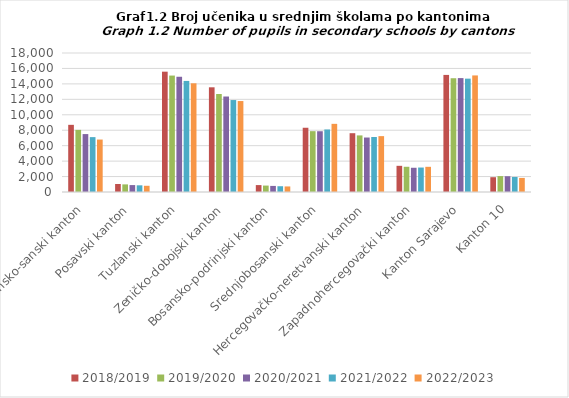
| Category | 2018/2019 | 2019/2020 | 2020/2021 | 2021/2022 | 2022/2023 |
|---|---|---|---|---|---|
| Unsko-sanski kanton | 8698 | 8046 | 7501 | 7107 | 6792 |
| Posavski kanton | 1037 | 986 | 896 | 865 | 805 |
| Tuzlanski kanton | 15582 | 15078 | 14923 | 14384 | 14078 |
| Zeničko-dobojski kanton | 13558 | 12688 | 12365 | 11908 | 11778 |
| Bosansko-podrinjski kanton | 896 | 832 | 788 | 748 | 720 |
| Srednjobosanski kanton | 8320 | 7878 | 7869 | 8097 | 8826 |
| Hercegovačko-neretvanski kanton | 7614 | 7328 | 7055 | 7121 | 7235 |
| Zapadnohercegovački kanton | 3390 | 3265 | 3138 | 3168 | 3262 |
| Kanton Sarajevo | 15162 | 14733 | 14750 | 14679 | 15095 |
| Kanton 10 | 1917 | 2058 | 2043 | 1947 | 1824 |